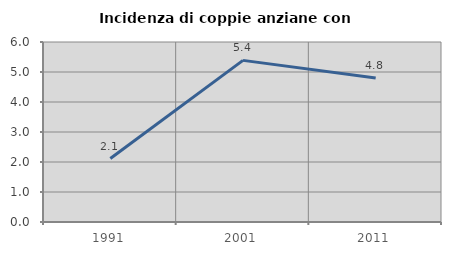
| Category | Incidenza di coppie anziane con figli |
|---|---|
| 1991.0 | 2.115 |
| 2001.0 | 5.387 |
| 2011.0 | 4.8 |